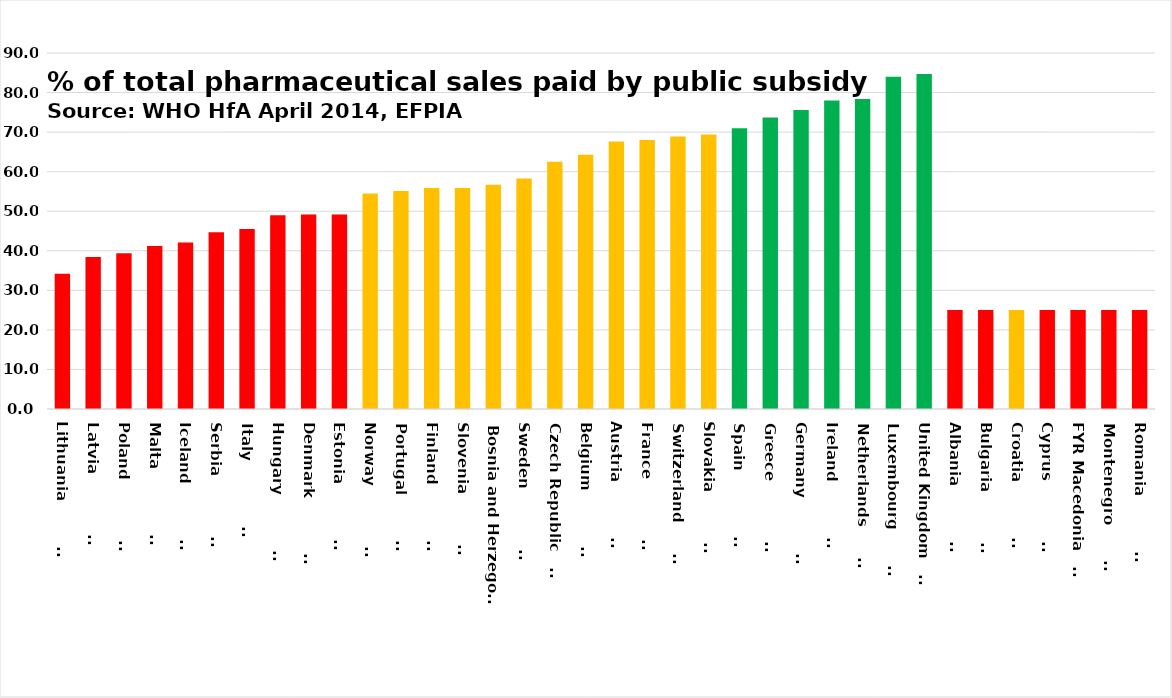
| Category | Series 0 |
|---|---|
| Lithuania              | 34.22 |
| Latvia                 | 38.4 |
| Poland                 | 39.4 |
| Malta                  | 41.2 |
| Iceland                | 42.1 |
| Serbia                 | 44.7 |
| Italy                  | 45.5 |
| Hungary                | 49 |
| Denmark                | 49.2 |
| Estonia                | 49.2 |
| Norway                 | 54.5 |
| Portugal               | 55.1 |
| Finland                | 55.9 |
| Slovenia               | 55.9 |
| Bosnia and Herzegovina | 56.7 |
| Sweden                 | 58.3 |
| Czech Republic         | 62.5 |
| Belgium                | 64.3 |
| Austria                | 67.6 |
| France                 | 68 |
| Switzerland            | 68.9 |
| Slovakia               | 69.4 |
| Spain                  | 71 |
| Greece                 | 73.7 |
| Germany                | 75.6 |
| Ireland                | 78 |
| Netherlands            | 78.4 |
| Luxembourg             | 84 |
| United Kingdom         | 84.7 |
| Albania                | 25 |
| Bulgaria               | 25 |
| Croatia                | 25 |
| Cyprus                 | 25 |
| FYR Macedonia         | 25 |
| Montenegro             | 25 |
| Romania                | 25 |